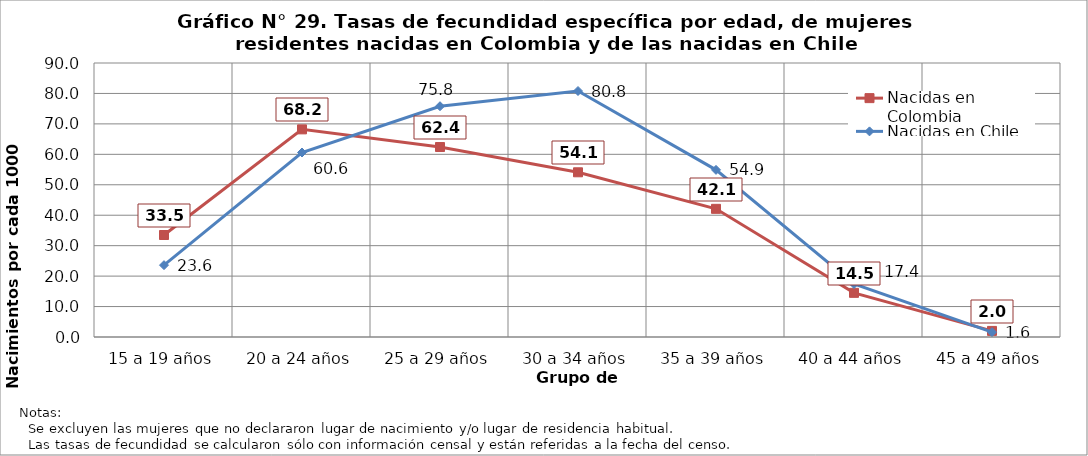
| Category | Nacidas en Colombia | Nacidas en Chile |
|---|---|---|
| 15 a 19 años | 33.5 | 23.6 |
| 20 a 24 años | 68.2 | 60.6 |
| 25 a 29 años | 62.4 | 75.8 |
| 30 a 34 años | 54.1 | 80.8 |
| 35 a 39 años | 42.1 | 54.9 |
| 40 a 44 años | 14.5 | 17.4 |
| 45 a 49 años | 2 | 1.6 |